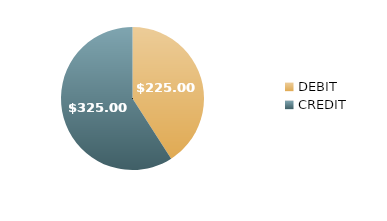
| Category | $225.00 |
|---|---|
| DEBIT | 225 |
| CREDIT | 325 |